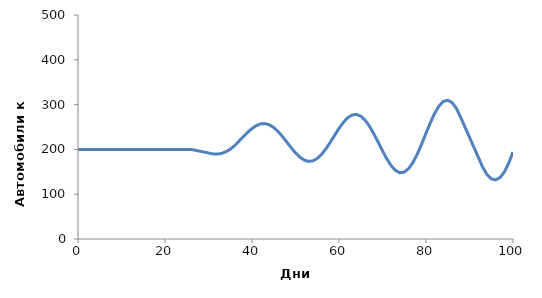
| Category | Запас автомобилей |
|---|---|
| 0.0 | 200 |
| 1.0 | 200 |
| 2.0 | 200 |
| 3.0 | 200 |
| 4.0 | 200 |
| 5.0 | 200 |
| 6.0 | 200 |
| 7.0 | 200 |
| 8.0 | 200 |
| 9.0 | 200 |
| 10.0 | 200 |
| 11.0 | 200 |
| 12.0 | 200 |
| 13.0 | 200 |
| 14.0 | 200 |
| 15.0 | 200 |
| 16.0 | 200 |
| 17.0 | 200 |
| 18.0 | 200 |
| 19.0 | 200 |
| 20.0 | 200 |
| 21.0 | 200 |
| 22.0 | 200 |
| 23.0 | 200 |
| 24.0 | 200 |
| 25.0 | 200 |
| 26.0 | 200 |
| 27.0 | 198 |
| 28.0 | 196 |
| 29.0 | 194 |
| 30.0 | 192 |
| 31.0 | 190 |
| 32.0 | 189.444 |
| 33.0 | 191 |
| 34.0 | 194.667 |
| 35.0 | 200.444 |
| 36.0 | 208.333 |
| 37.0 | 218.333 |
| 38.0 | 228.519 |
| 39.0 | 238.185 |
| 40.0 | 246.63 |
| 41.0 | 253.148 |
| 42.0 | 257.037 |
| 43.0 | 257.593 |
| 44.0 | 254.753 |
| 45.0 | 248.691 |
| 46.0 | 239.815 |
| 47.0 | 228.765 |
| 48.0 | 216.42 |
| 49.0 | 203.889 |
| 50.0 | 192.305 |
| 51.0 | 182.741 |
| 52.0 | 176.136 |
| 53.0 | 173.214 |
| 54.0 | 174.407 |
| 55.0 | 179.778 |
| 56.0 | 189.01 |
| 57.0 | 201.429 |
| 58.0 | 216.051 |
| 59.0 | 231.646 |
| 60.0 | 246.844 |
| 61.0 | 260.251 |
| 62.0 | 270.581 |
| 63.0 | 276.771 |
| 64.0 | 278.088 |
| 65.0 | 274.206 |
| 66.0 | 265.258 |
| 67.0 | 251.841 |
| 68.0 | 234.98 |
| 69.0 | 216.057 |
| 70.0 | 196.694 |
| 71.0 | 178.626 |
| 72.0 | 163.54 |
| 73.0 | 152.926 |
| 74.0 | 147.932 |
| 75.0 | 149.247 |
| 76.0 | 157.015 |
| 77.0 | 170.807 |
| 78.0 | 189.627 |
| 79.0 | 211.985 |
| 80.0 | 236.008 |
| 81.0 | 259.592 |
| 82.0 | 280.587 |
| 83.0 | 296.985 |
| 84.0 | 307.109 |
| 85.0 | 309.78 |
| 86.0 | 304.445 |
| 87.0 | 291.247 |
| 88.0 | 271.052 |
| 89.0 | 249.052 |
| 90.0 | 227.052 |
| 91.0 | 205.052 |
| 92.0 | 183.052 |
| 93.0 | 161.052 |
| 94.0 | 144.034 |
| 95.0 | 134.351 |
| 96.0 | 132 |
| 97.0 | 136.983 |
| 98.0 | 149.299 |
| 99.0 | 168.948 |
| 100.0 | 194.27 |